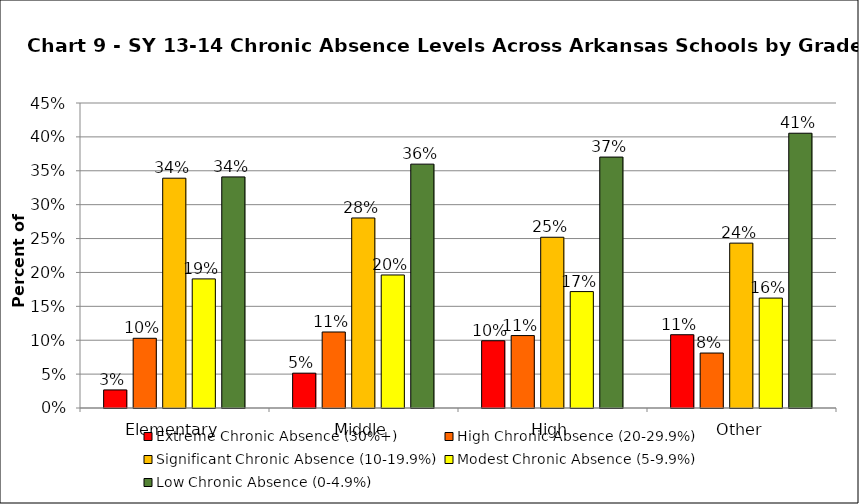
| Category | Extreme Chronic Absence (30%+) | High Chronic Absence (20-29.9%) | Significant Chronic Absence (10-19.9%) | Modest Chronic Absence (5-9.9%) | Low Chronic Absence (0-4.9%) |
|---|---|---|---|---|---|
| 0 | 0.027 | 0.103 | 0.339 | 0.19 | 0.341 |
| 1 | 0.051 | 0.112 | 0.28 | 0.196 | 0.36 |
| 2 | 0.099 | 0.107 | 0.252 | 0.172 | 0.37 |
| 3 | 0.108 | 0.081 | 0.243 | 0.162 | 0.405 |